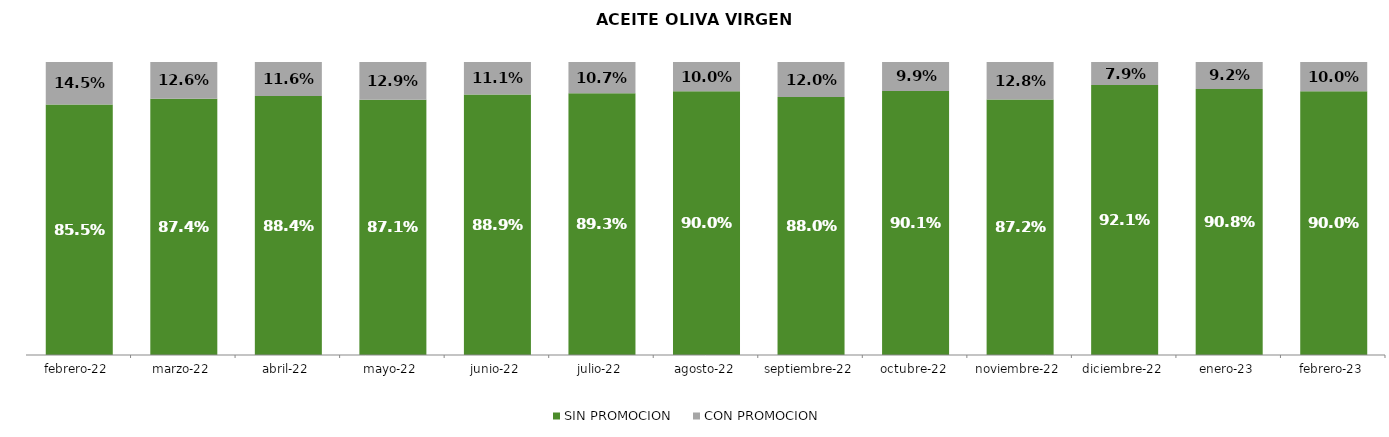
| Category | SIN PROMOCION   | CON PROMOCION   |
|---|---|---|
| 2022-02-01 | 0.855 | 0.145 |
| 2022-03-01 | 0.874 | 0.126 |
| 2022-04-01 | 0.884 | 0.116 |
| 2022-05-01 | 0.871 | 0.129 |
| 2022-06-01 | 0.889 | 0.111 |
| 2022-07-01 | 0.893 | 0.107 |
| 2022-08-01 | 0.9 | 0.1 |
| 2022-09-01 | 0.88 | 0.12 |
| 2022-10-01 | 0.901 | 0.099 |
| 2022-11-01 | 0.872 | 0.128 |
| 2022-12-01 | 0.921 | 0.079 |
| 2023-01-01 | 0.908 | 0.092 |
| 2023-02-01 | 0.9 | 0.1 |